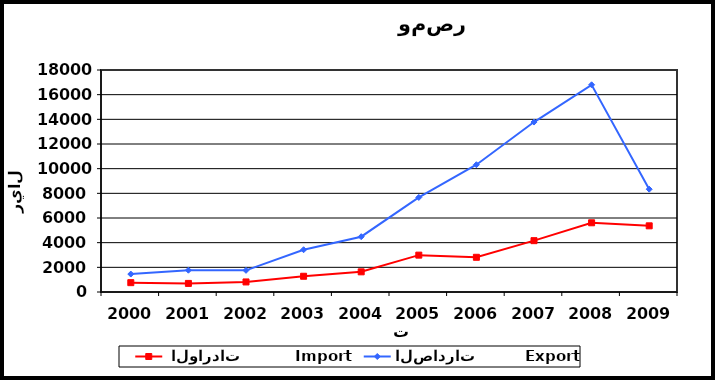
| Category |  الواردات           Import | الصادرات          Export |
|---|---|---|
| 2000.0 | 757 | 1455 |
| 2001.0 | 696 | 1768 |
| 2002.0 | 815 | 1757 |
| 2003.0 | 1277 | 3427 |
| 2004.0 | 1635 | 4484 |
| 2005.0 | 2989 | 7666 |
| 2006.0 | 2814 | 10320 |
| 2007.0 | 4163 | 13779 |
| 2008.0 | 5612 | 16799 |
| 2009.0 | 5365 | 8336 |